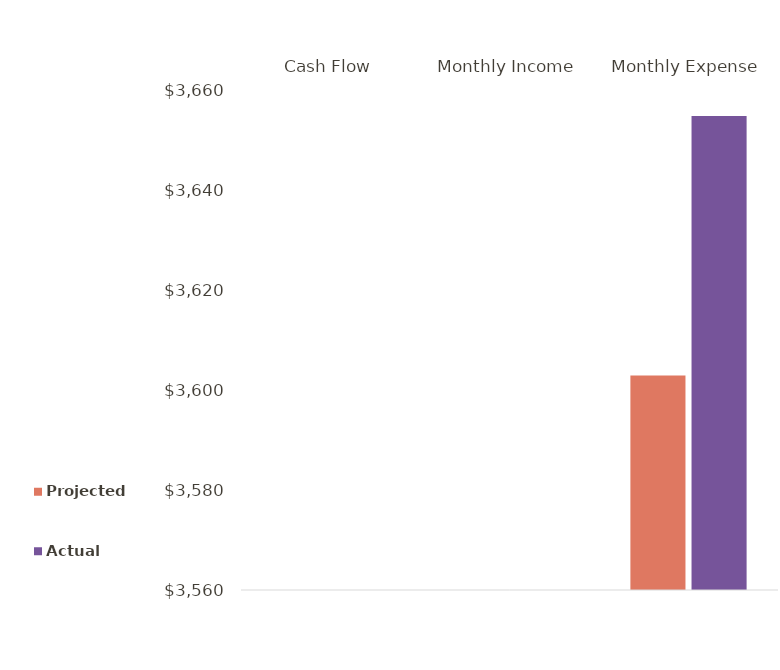
| Category | Projected | Actual |
|---|---|---|
| Cash Flow | 0 | 0 |
| Monthly Income | 0 | 0 |
| Monthly Expense | 3603 | 3655 |